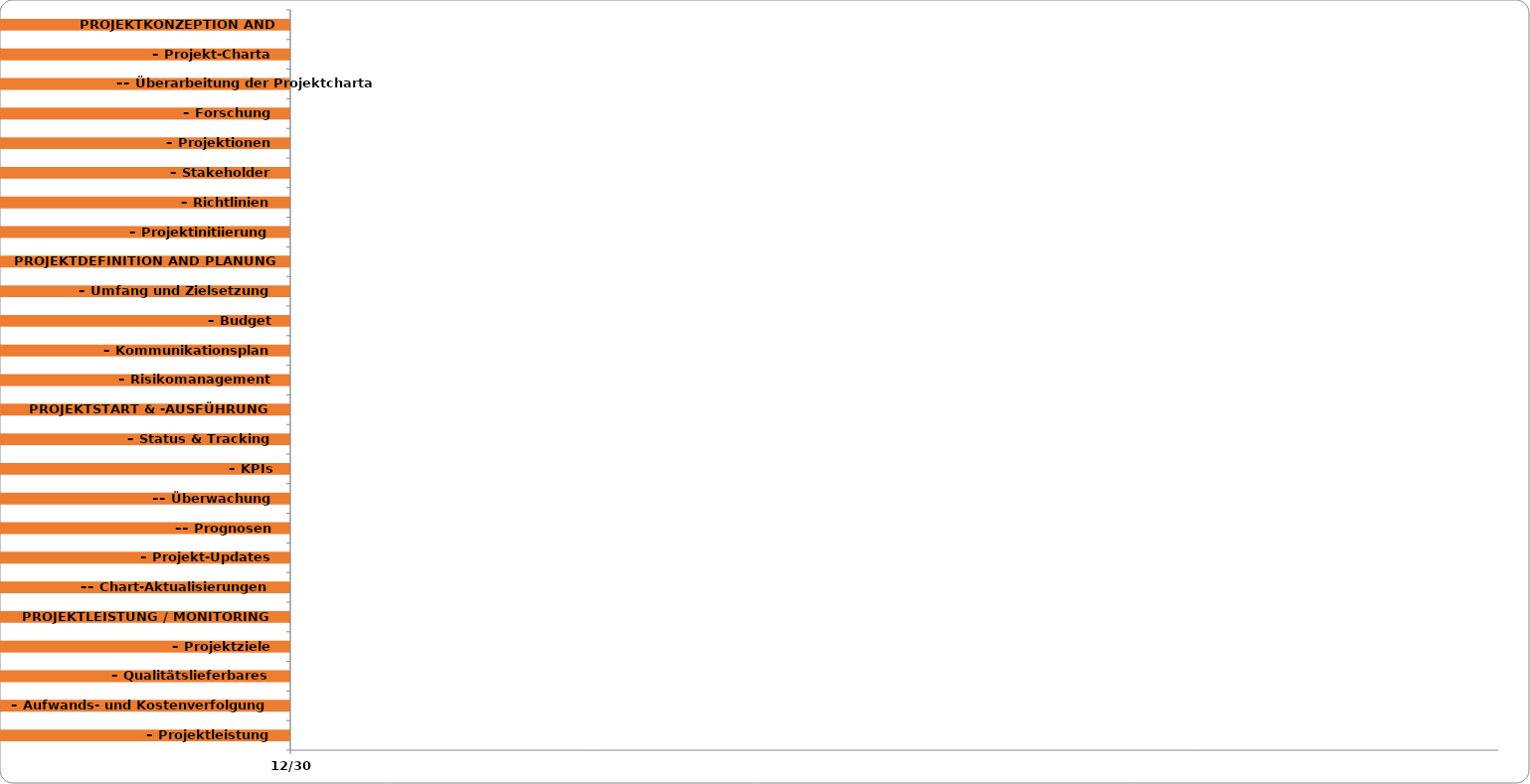
| Category | STARTDATUM | DAUER  in Tagen |
|---|---|---|
| PROJEKTKONZEPTION AND INITIIERUNG |  | 1 |
| – Projekt-Charta |  | 1 |
| –– Überarbeitung der Projektcharta |  | 1 |
| – Forschung |  | 1 |
| – Projektionen |  | 1 |
| – Stakeholder |  | 1 |
| – Richtlinien |  | 1 |
| – Projektinitiierung |  | 1 |
| PROJEKTDEFINITION AND PLANUNG |  | 1 |
| – Umfang und Zielsetzung |  | 1 |
| – Budget |  | 1 |
| – Kommunikationsplan |  | 1 |
| – Risikomanagement |  | 1 |
| PROJEKTSTART & -AUSFÜHRUNG |  | 1 |
| – Status & Tracking |  | 1 |
| – KPIs |  | 1 |
| –– Überwachung |  | 1 |
| –– Prognosen |  | 1 |
| – Projekt-Updates |  | 1 |
| –– Chart-Aktualisierungen |  | 1 |
| PROJEKTLEISTUNG / MONITORING |  | 1 |
| – Projektziele |  | 1 |
| – Qualitätslieferbares |  | 1 |
| – Aufwands- und Kostenverfolgung |  | 1 |
| – Projektleistung |  | 1 |